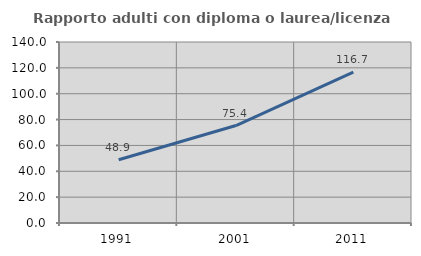
| Category | Rapporto adulti con diploma o laurea/licenza media  |
|---|---|
| 1991.0 | 48.892 |
| 2001.0 | 75.381 |
| 2011.0 | 116.652 |